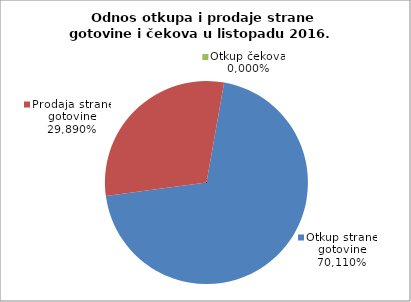
| Category | Otkup strane gotovine |
|---|---|
| 0 | 0.701 |
| 1 | 0.299 |
| 2 | 0 |